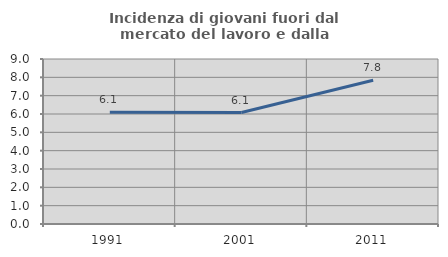
| Category | Incidenza di giovani fuori dal mercato del lavoro e dalla formazione  |
|---|---|
| 1991.0 | 6.093 |
| 2001.0 | 6.08 |
| 2011.0 | 7.837 |